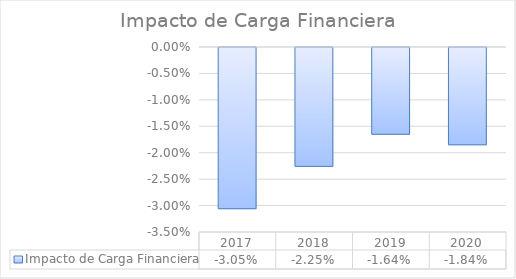
| Category | Impacto de Carga Financiera |
|---|---|
| 2017.0 | -0.031 |
| 2018.0 | -0.022 |
| 2019.0 | -0.016 |
| 2020.0 | -0.018 |